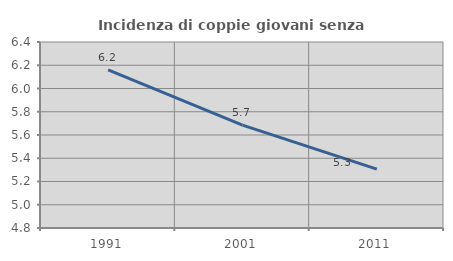
| Category | Incidenza di coppie giovani senza figli |
|---|---|
| 1991.0 | 6.159 |
| 2001.0 | 5.685 |
| 2011.0 | 5.306 |